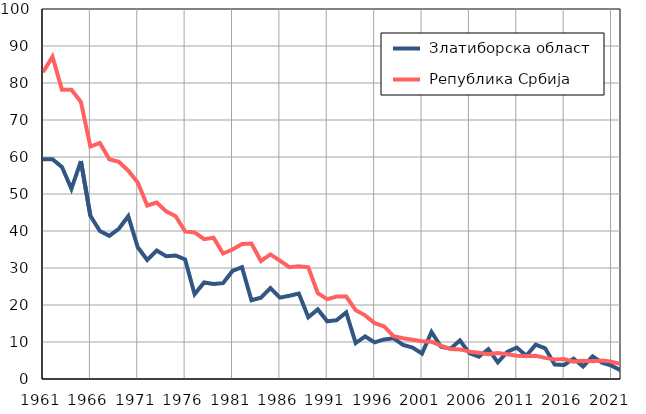
| Category |  Златиборска област |  Република Србија |
|---|---|---|
| 1961.0 | 59.4 | 82.9 |
| 1962.0 | 59.4 | 87.1 |
| 1963.0 | 57.3 | 78.2 |
| 1964.0 | 51.4 | 78.2 |
| 1965.0 | 58.9 | 74.9 |
| 1966.0 | 44.1 | 62.8 |
| 1967.0 | 40 | 63.8 |
| 1968.0 | 38.7 | 59.4 |
| 1969.0 | 40.6 | 58.7 |
| 1970.0 | 44 | 56.3 |
| 1971.0 | 35.6 | 53.1 |
| 1972.0 | 32.2 | 46.9 |
| 1973.0 | 34.7 | 47.7 |
| 1974.0 | 33.2 | 45.3 |
| 1975.0 | 33.4 | 44 |
| 1976.0 | 32.3 | 39.9 |
| 1977.0 | 22.9 | 39.6 |
| 1978.0 | 26.1 | 37.8 |
| 1979.0 | 25.7 | 38.2 |
| 1980.0 | 25.9 | 33.9 |
| 1981.0 | 29.2 | 35 |
| 1982.0 | 30.2 | 36.5 |
| 1983.0 | 21.3 | 36.6 |
| 1984.0 | 22 | 31.9 |
| 1985.0 | 24.6 | 33.7 |
| 1986.0 | 22 | 32 |
| 1987.0 | 22.5 | 30.2 |
| 1988.0 | 23.1 | 30.5 |
| 1989.0 | 16.7 | 30.2 |
| 1990.0 | 18.8 | 23.2 |
| 1991.0 | 15.6 | 21.6 |
| 1992.0 | 15.9 | 22.3 |
| 1993.0 | 18 | 22.3 |
| 1994.0 | 9.7 | 18.6 |
| 1995.0 | 11.5 | 17.2 |
| 1996.0 | 9.9 | 15.1 |
| 1997.0 | 10.7 | 14.2 |
| 1998.0 | 11 | 11.6 |
| 1999.0 | 9.2 | 11 |
| 2000.0 | 8.5 | 10.6 |
| 2001.0 | 6.9 | 10.2 |
| 2002.0 | 12.7 | 10.1 |
| 2003.0 | 8.7 | 9 |
| 2004.0 | 8.2 | 8.1 |
| 2005.0 | 10.4 | 8 |
| 2006.0 | 7 | 7.4 |
| 2007.0 | 6 | 7.1 |
| 2008.0 | 8.1 | 6.7 |
| 2009.0 | 4.5 | 7 |
| 2010.0 | 7.3 | 6.7 |
| 2011.0 | 8.5 | 6.3 |
| 2012.0 | 6.3 | 6.2 |
| 2013.0 | 9.3 | 6.3 |
| 2014.0 | 8.3 | 5.7 |
| 2015.0 | 3.9 | 5.3 |
| 2016.0 | 3.8 | 5.4 |
| 2017.0 | 5.5 | 4.7 |
| 2018.0 | 3.4 | 4.9 |
| 2019.0 | 6.1 | 4.8 |
| 2020.0 | 4.4 | 5 |
| 2021.0 | 3.6 | 4.7 |
| 2022.0 | 2.3 | 4 |